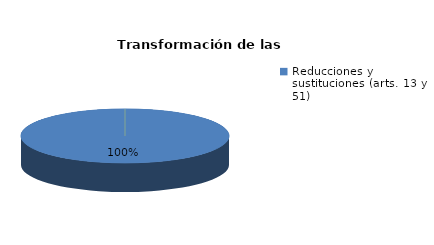
| Category | Series 0 |
|---|---|
| Reducciones y sustituciones (arts. 13 y 51) | 8 |
| Por quebrantamiento (art. 50.2) | 0 |
| Cancelaciones anticipadas | 0 |
| Traslado a Centros Penitenciarios | 0 |
| Conversión internamientos en cerrados (art. 51.2) | 0 |